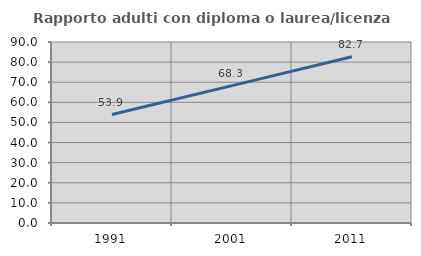
| Category | Rapporto adulti con diploma o laurea/licenza media  |
|---|---|
| 1991.0 | 53.929 |
| 2001.0 | 68.306 |
| 2011.0 | 82.682 |